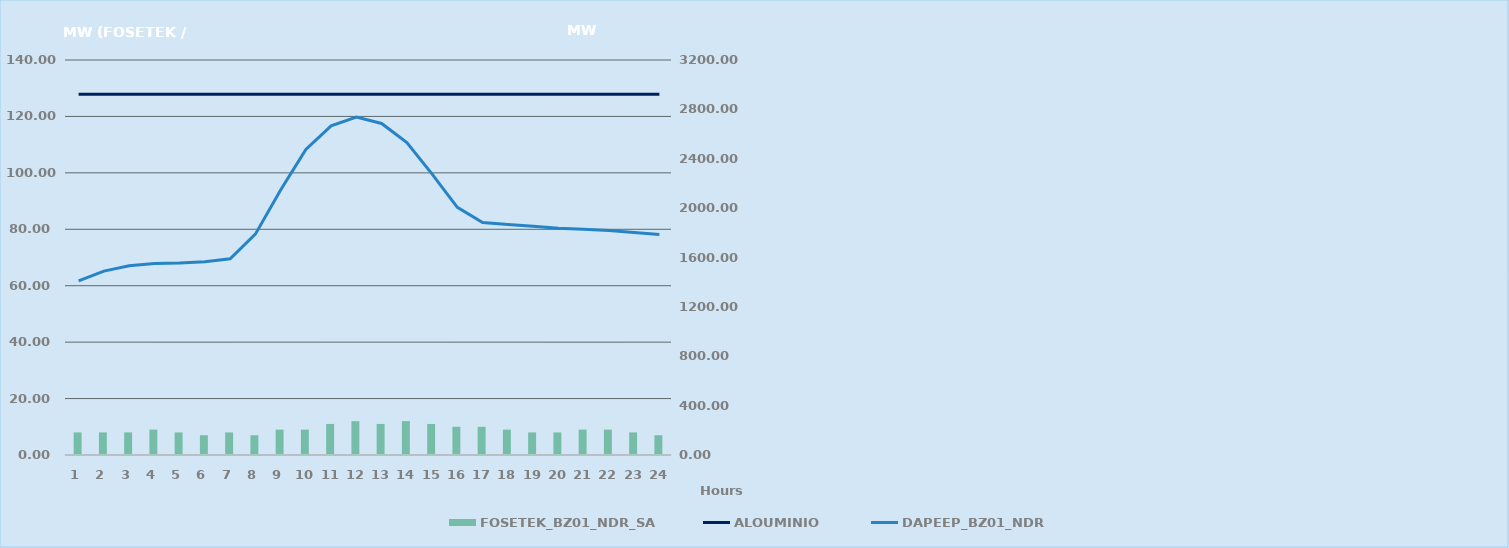
| Category | FOSETEK_BZ01_NDR_SA |
|---|---|
| 0 | 8 |
| 1 | 8 |
| 2 | 8 |
| 3 | 9 |
| 4 | 8 |
| 5 | 7 |
| 6 | 8 |
| 7 | 7 |
| 8 | 9 |
| 9 | 9 |
| 10 | 11 |
| 11 | 12 |
| 12 | 11 |
| 13 | 12 |
| 14 | 11 |
| 15 | 10 |
| 16 | 10 |
| 17 | 9 |
| 18 | 8 |
| 19 | 8 |
| 20 | 9 |
| 21 | 9 |
| 22 | 8 |
| 23 | 7 |